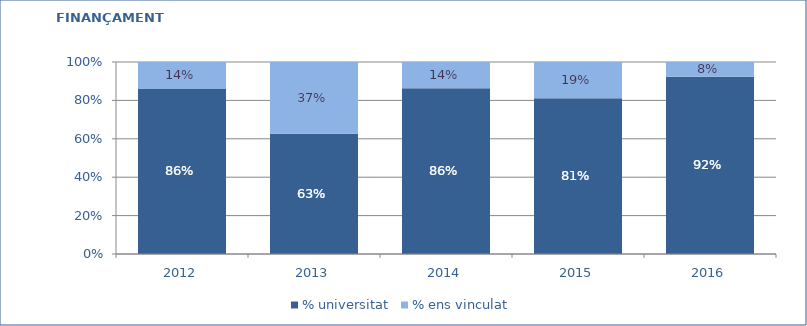
| Category | % universitat | % ens vinculat |
|---|---|---|
| 2012.0 | 0.86 | 0.14 |
| 2013.0 | 0.626 | 0.374 |
| 2014.0 | 0.863 | 0.137 |
| 2015.0 | 0.811 | 0.189 |
| 2016.0 | 0.923 | 0.077 |